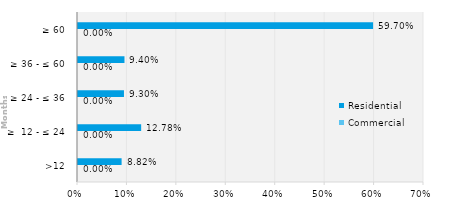
| Category | Commercial | Residential |
|---|---|---|
| >12 | 0 | 0.088 |
| ≥  12 - ≤ 24 | 0 | 0.128 |
| ≥ 24 - ≤ 36 | 0 | 0.093 |
| ≥ 36 - ≤ 60 | 0 | 0.094 |
| ≥ 60 | 0 | 0.597 |